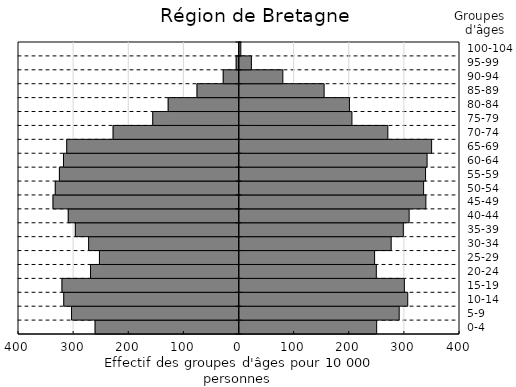
| Category | Hommes | Femmes  |
|---|---|---|
| 0-4 | -261.055 | 248.81 |
| 5-9 | -303.784 | 289.709 |
| 10-14 | -317.904 | 305.203 |
| 15-19 | -321.123 | 299.053 |
| 20-24 | -269.308 | 248.199 |
| 25-29 | -253.156 | 245.084 |
| 30-34 | -272.766 | 275.195 |
| 35-39 | -296.892 | 297.155 |
| 40-44 | -309.73 | 307.742 |
| 45-49 | -337.407 | 338.068 |
| 50-54 | -333.29 | 333.985 |
| 55-59 | -325.773 | 337.508 |
| 60-64 | -318.369 | 340.313 |
| 65-69 | -312.502 | 348.522 |
| 70-74 | -228.391 | 269.1 |
| 75-79 | -156.46 | 203.988 |
| 80-84 | -128.485 | 199.421 |
| 85-89 | -76.164 | 153.536 |
| 90-94 | -28.615 | 78.629 |
| 95-99 | -5.115 | 21.596 |
| 100-104 | -0.51 | 2.388 |